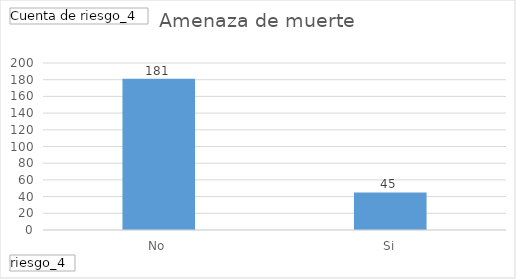
| Category | Total |
|---|---|
| No | 181 |
| Si | 45 |